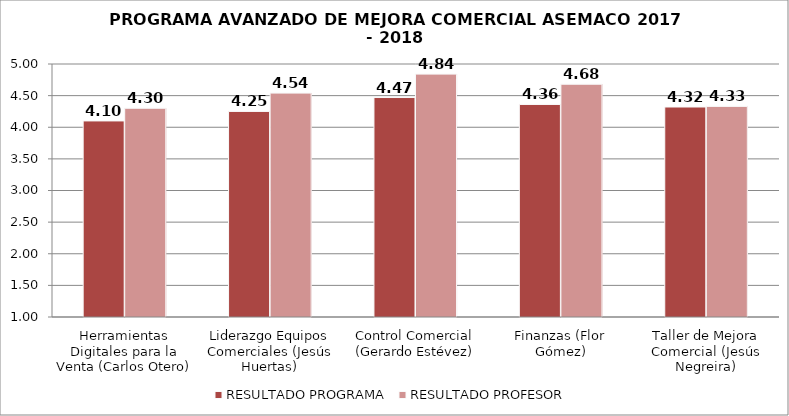
| Category | RESULTADO PROGRAMA | RESULTADO PROFESOR |
|---|---|---|
| Herramientas Digitales para la Venta (Carlos Otero) | 4.1 | 4.3 |
| Liderazgo Equipos Comerciales (Jesús Huertas) | 4.25 | 4.54 |
| Control Comercial (Gerardo Estévez) | 4.47 | 4.84 |
| Finanzas (Flor Gómez) | 4.36 | 4.68 |
| Taller de Mejora Comercial (Jesús Negreira) | 4.32 | 4.33 |